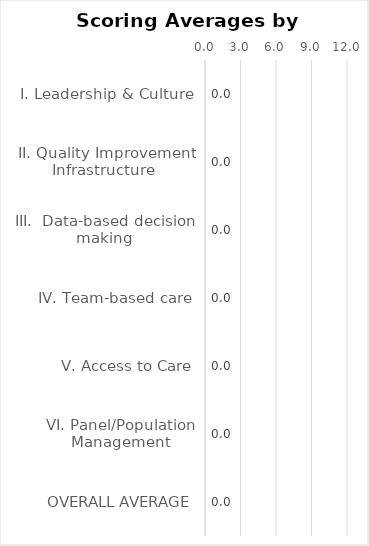
| Category | Series 0 |
|---|---|
| I. Leadership & Culture | 0 |
| II. Quality Improvement Infrastructure  | 0 |
| III.  Data-based decision making | 0 |
| IV. Team-based care | 0 |
| V. Access to Care | 0 |
| VI. Panel/Population Management | 0 |
| OVERALL AVERAGE | 0 |